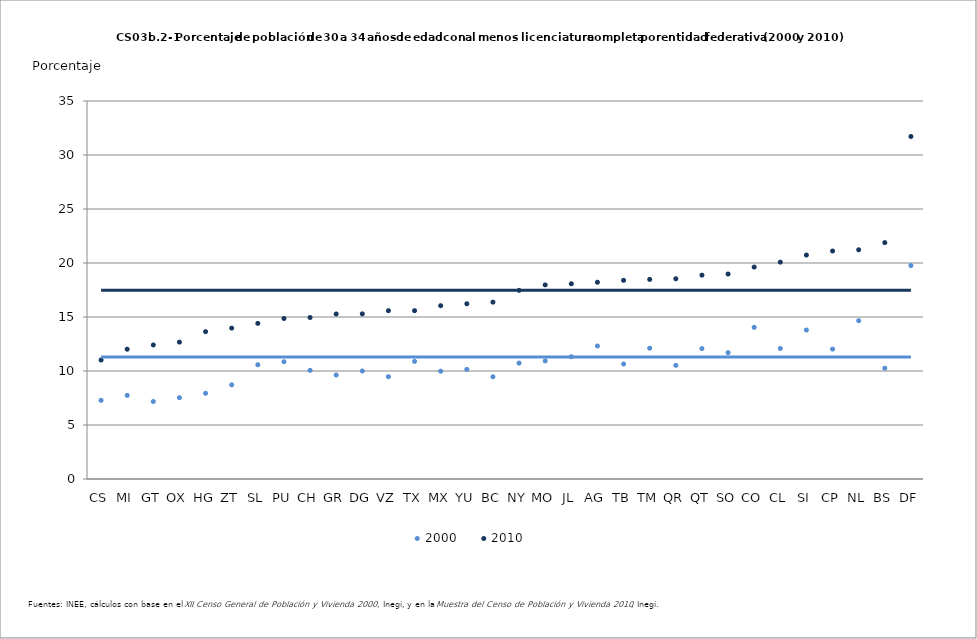
| Category | 2000 | 2010 | Nacional 2000 | Nacional 2010 |
|---|---|---|---|---|
| CS | 7.283 | 11.02 | 11.285 | 17.485 |
| MI | 7.746 | 12.018 | 11.285 | 17.485 |
| GT | 7.177 | 12.411 | 11.285 | 17.485 |
| OX | 7.534 | 12.673 | 11.285 | 17.485 |
| HG | 7.936 | 13.644 | 11.285 | 17.485 |
| ZT | 8.719 | 13.97 | 11.285 | 17.485 |
| SL | 10.582 | 14.41 | 11.285 | 17.485 |
| PU | 10.856 | 14.861 | 11.285 | 17.485 |
| CH | 10.064 | 14.954 | 11.285 | 17.485 |
| GR | 9.629 | 15.279 | 11.285 | 17.485 |
| DG | 10.002 | 15.294 | 11.285 | 17.485 |
| VZ | 9.473 | 15.585 | 11.285 | 17.485 |
| TX | 10.886 | 15.586 | 11.285 | 17.485 |
| MX | 9.98 | 16.046 | 11.285 | 17.485 |
| YU | 10.151 | 16.224 | 11.285 | 17.485 |
| BC | 9.469 | 16.374 | 11.285 | 17.485 |
| NY | 10.734 | 17.469 | 11.285 | 17.485 |
| MO | 10.933 | 17.974 | 11.285 | 17.485 |
| JL | 11.326 | 18.076 | 11.285 | 17.485 |
| AG | 12.318 | 18.218 | 11.285 | 17.485 |
| TB | 10.652 | 18.397 | 11.285 | 17.485 |
| TM | 12.109 | 18.479 | 11.285 | 17.485 |
| QR | 10.526 | 18.54 | 11.285 | 17.485 |
| QT | 12.077 | 18.873 | 11.285 | 17.485 |
| SO | 11.695 | 18.979 | 11.285 | 17.485 |
| CO | 14.043 | 19.62 | 11.285 | 17.485 |
| CL | 12.085 | 20.079 | 11.285 | 17.485 |
| SI | 13.794 | 20.736 | 11.285 | 17.485 |
| CP | 12.028 | 21.112 | 11.285 | 17.485 |
| NL | 14.66 | 21.224 | 11.285 | 17.485 |
| BS | 10.26 | 21.888 | 11.285 | 17.485 |
| DF | 19.764 | 31.714 | 11.285 | 17.485 |